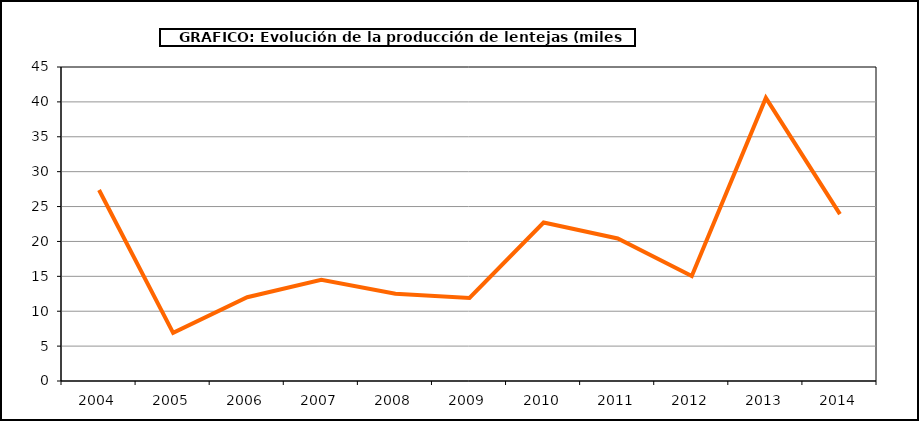
| Category | Producción |
|---|---|
| 2004.0 | 27.378 |
| 2005.0 | 6.9 |
| 2006.0 | 12 |
| 2007.0 | 14.496 |
| 2008.0 | 12.516 |
| 2009.0 | 11.9 |
| 2010.0 | 22.715 |
| 2011.0 | 20.426 |
| 2012.0 | 15.046 |
| 2013.0 | 40.57 |
| 2014.0 | 23.905 |